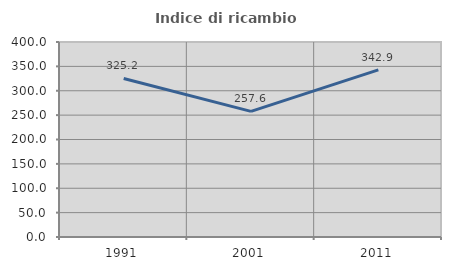
| Category | Indice di ricambio occupazionale  |
|---|---|
| 1991.0 | 325.185 |
| 2001.0 | 257.609 |
| 2011.0 | 342.941 |